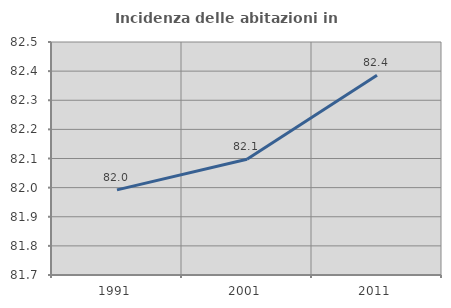
| Category | Incidenza delle abitazioni in proprietà  |
|---|---|
| 1991.0 | 81.992 |
| 2001.0 | 82.097 |
| 2011.0 | 82.385 |